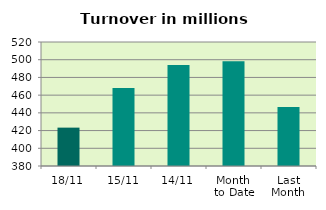
| Category | Series 0 |
|---|---|
| 18/11 | 423.321 |
| 15/11 | 468.016 |
| 14/11 | 493.941 |
| Month 
to Date | 498.209 |
| Last
Month | 446.481 |